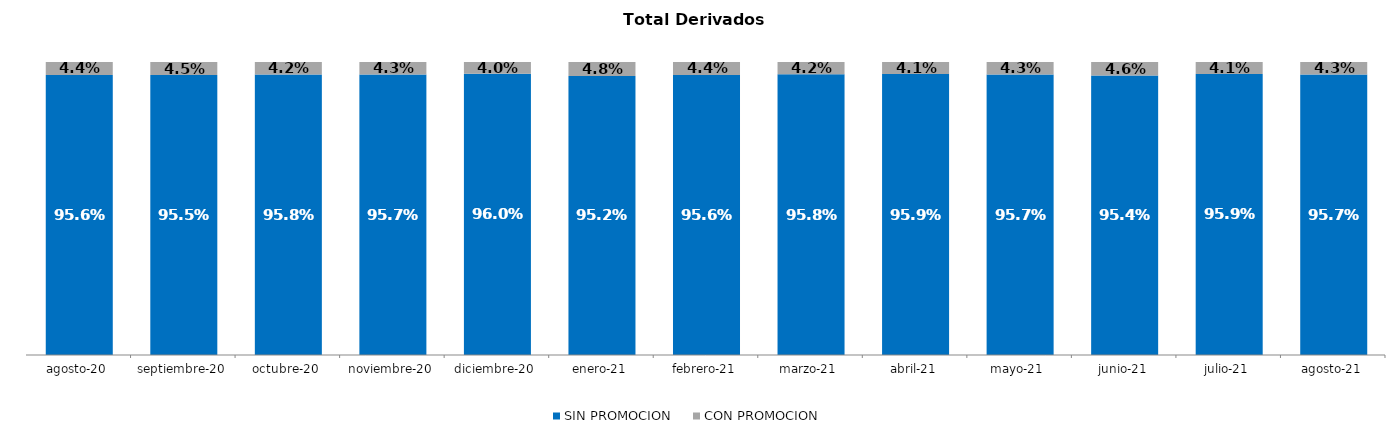
| Category | SIN PROMOCION   | CON PROMOCION   |
|---|---|---|
| 2020-08-01 | 0.956 | 0.044 |
| 2020-09-01 | 0.955 | 0.045 |
| 2020-10-01 | 0.958 | 0.042 |
| 2020-11-01 | 0.957 | 0.043 |
| 2020-12-01 | 0.96 | 0.04 |
| 2021-01-01 | 0.952 | 0.048 |
| 2021-02-01 | 0.956 | 0.044 |
| 2021-03-01 | 0.958 | 0.042 |
| 2021-04-01 | 0.959 | 0.041 |
| 2021-05-01 | 0.957 | 0.043 |
| 2021-06-01 | 0.954 | 0.046 |
| 2021-07-01 | 0.959 | 0.041 |
| 2021-08-01 | 0.957 | 0.043 |